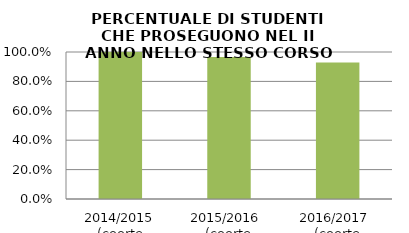
| Category | 2014/2015 (coorte 2013/14) 2015/2016  (coorte 2014/15) 2016/2017  (coorte 2015/16) |
|---|---|
| 2014/2015 (coorte 2013/14) | 1 |
| 2015/2016  (coorte 2014/15) | 0.967 |
| 2016/2017  (coorte 2015/16) | 0.929 |